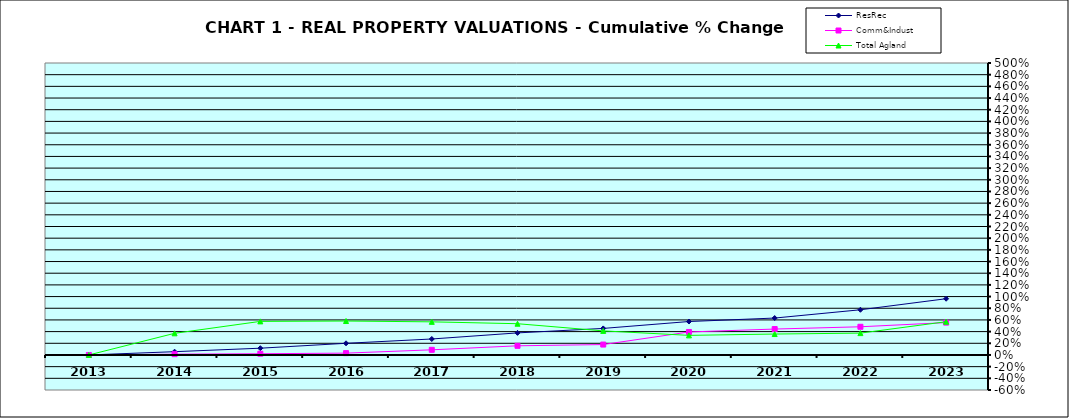
| Category | ResRec | Comm&Indust | Total Agland |
|---|---|---|---|
| 2013.0 | 0 | 0 | 0 |
| 2014.0 | 0.056 | 0.014 | 0.371 |
| 2015.0 | 0.116 | 0.021 | 0.575 |
| 2016.0 | 0.2 | 0.031 | 0.581 |
| 2017.0 | 0.274 | 0.088 | 0.567 |
| 2018.0 | 0.378 | 0.157 | 0.535 |
| 2019.0 | 0.455 | 0.178 | 0.412 |
| 2020.0 | 0.573 | 0.394 | 0.336 |
| 2021.0 | 0.632 | 0.444 | 0.358 |
| 2022.0 | 0.774 | 0.483 | 0.374 |
| 2023.0 | 0.963 | 0.554 | 0.57 |